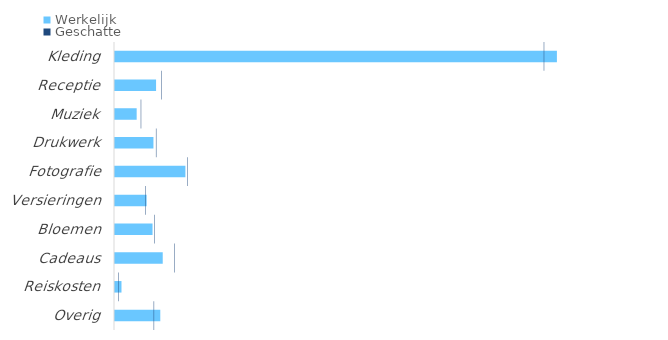
| Category | Werkelijk |
|---|---|
| Kleding | 9770 |
| Receptie | 928 |
| Muziek | 500 |
| Drukwerk | 870 |
| Fotografie | 1575 |
| Versieringen | 720 |
| Bloemen | 850 |
| Cadeaus | 1075 |
| Reiskosten | 165 |
| Overig | 1021 |